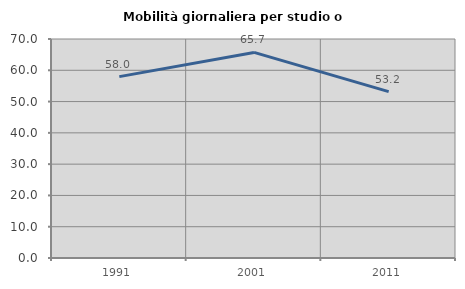
| Category | Mobilità giornaliera per studio o lavoro |
|---|---|
| 1991.0 | 57.971 |
| 2001.0 | 65.714 |
| 2011.0 | 53.165 |